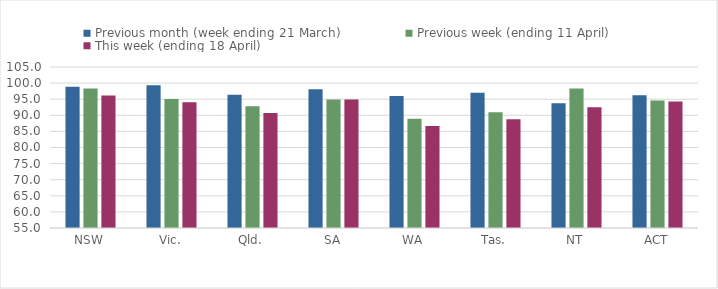
| Category | Previous month (week ending 21 March) | Previous week (ending 11 April) | This week (ending 18 April) |
|---|---|---|---|
| NSW | 98.855 | 98.34 | 96.114 |
| Vic. | 99.301 | 95.045 | 94.085 |
| Qld. | 96.409 | 92.818 | 90.753 |
| SA | 98.07 | 94.934 | 94.883 |
| WA | 96.004 | 88.896 | 86.703 |
| Tas. | 96.974 | 90.922 | 88.771 |
| NT | 93.724 | 98.326 | 92.51 |
| ACT | 96.22 | 94.577 | 94.306 |